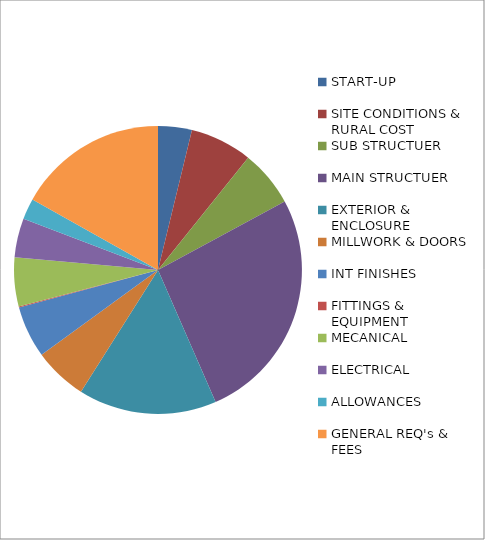
| Category | Series 0 |
|---|---|
| START-UP | 31541.66 |
| SITE CONDITIONS & RURAL COST | 58000 |
| SUB STRUCTUER | 52788.633 |
| MAIN STRUCTUER | 219028.08 |
| EXTERIOR & ENCLOSURE | 129239.765 |
| MILLWORK & DOORS | 49913 |
| INT FINISHES | 48343 |
| FITTINGS & EQUIPMENT | 950 |
| MECANICAL | 45627.5 |
| ELECTRICAL | 36621.5 |
| ALLOWANCES | 19464.286 |
| GENERAL REQ's & FEES | 140170.724 |